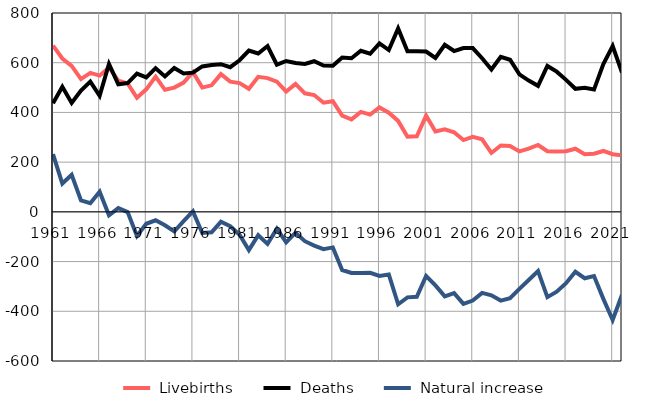
| Category |  Livebirths |  Deaths |  Natural increase |
|---|---|---|---|
| 1961.0 | 669 | 437 | 232 |
| 1962.0 | 617 | 503 | 114 |
| 1963.0 | 587 | 438 | 149 |
| 1964.0 | 534 | 488 | 46 |
| 1965.0 | 559 | 524 | 35 |
| 1966.0 | 548 | 467 | 81 |
| 1967.0 | 581 | 595 | -14 |
| 1968.0 | 528 | 513 | 15 |
| 1969.0 | 517 | 518 | -1 |
| 1970.0 | 459 | 556 | -97 |
| 1971.0 | 493 | 541 | -48 |
| 1972.0 | 544 | 578 | -34 |
| 1973.0 | 491 | 545 | -54 |
| 1974.0 | 500 | 579 | -79 |
| 1975.0 | 520 | 557 | -37 |
| 1976.0 | 562 | 560 | 2 |
| 1977.0 | 500 | 585 | -85 |
| 1978.0 | 509 | 591 | -82 |
| 1979.0 | 554 | 594 | -40 |
| 1980.0 | 524 | 582 | -58 |
| 1981.0 | 518 | 610 | -92 |
| 1982.0 | 495 | 649 | -154 |
| 1983.0 | 543 | 637 | -94 |
| 1984.0 | 538 | 667 | -129 |
| 1985.0 | 524 | 592 | -68 |
| 1986.0 | 484 | 607 | -123 |
| 1987.0 | 515 | 599 | -84 |
| 1988.0 | 477 | 595 | -118 |
| 1989.0 | 470 | 606 | -136 |
| 1990.0 | 439 | 589 | -150 |
| 1991.0 | 445 | 588 | -143 |
| 1992.0 | 387 | 621 | -234 |
| 1993.0 | 372 | 618 | -246 |
| 1994.0 | 402 | 648 | -246 |
| 1995.0 | 391 | 636 | -245 |
| 1996.0 | 420 | 678 | -258 |
| 1997.0 | 399 | 651 | -252 |
| 1998.0 | 366 | 738 | -372 |
| 1999.0 | 302 | 646 | -344 |
| 2000.0 | 304 | 646 | -342 |
| 2001.0 | 387 | 645 | -258 |
| 2002.0 | 323 | 619 | -296 |
| 2003.0 | 332 | 672 | -340 |
| 2004.0 | 320 | 647 | -327 |
| 2005.0 | 289 | 659 | -370 |
| 2006.0 | 302 | 659 | -357 |
| 2007.0 | 292 | 618 | -326 |
| 2008.0 | 237 | 573 | -336 |
| 2009.0 | 267 | 624 | -357 |
| 2010.0 | 265 | 612 | -347 |
| 2011.0 | 243 | 553 | -310 |
| 2012.0 | 254 | 528 | -274 |
| 2013.0 | 269 | 507 | -238 |
| 2014.0 | 244 | 587 | -343 |
| 2015.0 | 243 | 564 | -321 |
| 2016.0 | 244 | 531 | -287 |
| 2017.0 | 254 | 495 | -241 |
| 2018.0 | 232 | 499 | -267 |
| 2019.0 | 234 | 492 | -258 |
| 2020.0 | 245 | 595 | -350 |
| 2021.0 | 232 | 667 | -435 |
| 2022.0 | 227 | 560 | -333 |